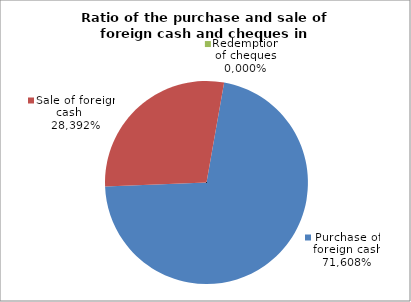
| Category | Purchase of foreign cash |
|---|---|
| 0 | 0.716 |
| 1 | 0.284 |
| 2 | 0 |